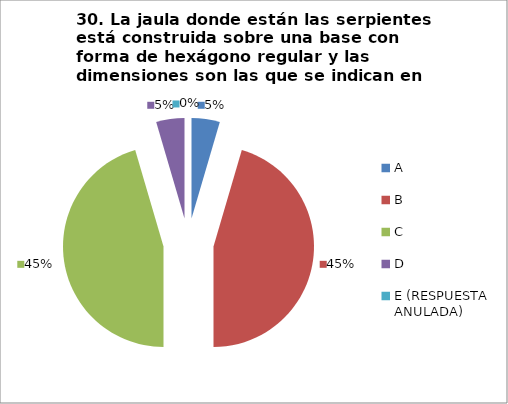
| Category | CANTIDAD DE RESPUESTAS PREGUNTA (30) | PORCENTAJE |
|---|---|---|
| A | 1 | 0.045 |
| B | 10 | 0.455 |
| C | 10 | 0.455 |
| D | 1 | 0.045 |
| E (RESPUESTA ANULADA) | 0 | 0 |